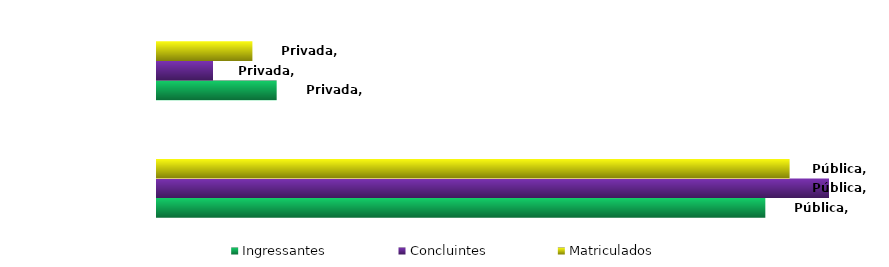
| Category | Ingressantes | Concluintes | Matriculados |
|---|---|---|---|
| Pública | 0.836 | 0.923 | 0.869 |
| Privada | 0.164 | 0.077 | 0.131 |